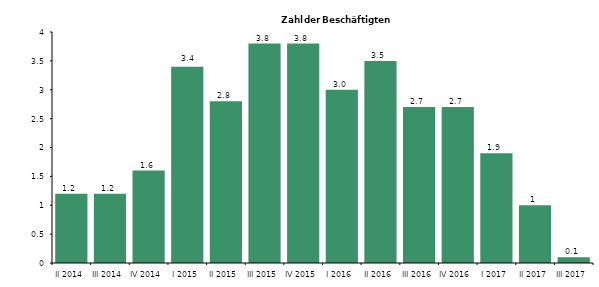
| Category | 1,2 1,2 1,6 3,4 2,8 3,8 3,8 3,0 3,5 2,7 2,7 1,9 1 0,1 |
|---|---|
| II 2014 | 1.2 |
| III 2014 | 1.2 |
| IV 2014 | 1.6 |
| I 2015 | 3.4 |
| II 2015 | 2.8 |
| III 2015 | 3.8 |
| IV 2015 | 3.8 |
| I 2016 | 3 |
| II 2016 | 3.5 |
| III 2016 | 2.7 |
| IV 2016 | 2.7 |
| I 2017 | 1.9 |
| II 2017 | 1 |
| III 2017 | 0.1 |